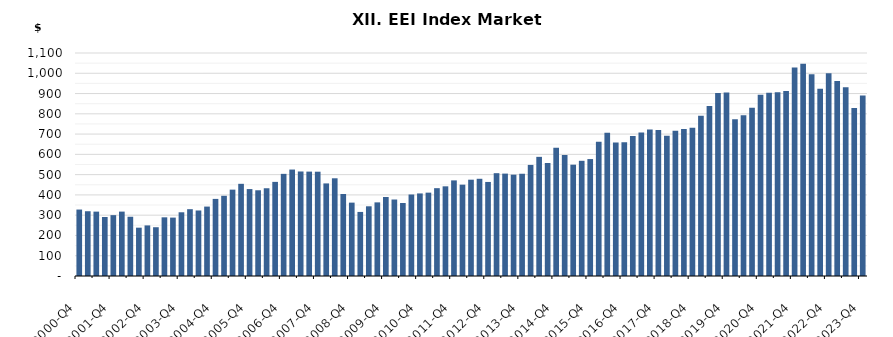
| Category | Series 0 |
|---|---|
|  2000-Q4  | 327.808 |
|  2001-Q1  | 319.484 |
|  2001-Q2  | 317.546 |
|  2001-Q3  | 291.035 |
|  2001-Q4  | 300.2 |
|  2002-Q1  | 317.668 |
|  2002-Q2  | 292.238 |
|  2002-Q3  | 238.331 |
|  2002-Q4  | 249.553 |
|  2003-Q1  | 240.598 |
|  2003-Q2  | 289.454 |
|  2003-Q3  | 288.073 |
|  2003-Q4  | 314.324 |
|  2004-Q1  | 329.601 |
|  2004-Q2  | 323.193 |
|  2004-Q3  | 342.46 |
|  2004-Q4  | 380.305 |
|  2005-Q1  | 395.663 |
|  2005-Q2  | 425.989 |
|  2005-Q3  | 454.727 |
|  2005-Q4  | 428.825 |
|  2006-Q1  | 422.899 |
|  2006-Q2  | 432.848 |
|  2006-Q3  | 464.281 |
|  2006-Q4  | 503.858 |
|  2007-Q1  | 525.088 |
|  2007-Q2  | 515.565 |
|  2007-Q3  | 514.946 |
|  2007-Q4  | 514.486 |
|  2008-Q1  | 456.711 |
|  2008-Q2  | 482.024 |
|  2008-Q3  | 404.472 |
|  2008-Q4  | 361.921 |
|  2009-Q1  | 316.07 |
|  2009-Q2  | 343.844 |
|  2009-Q3  | 363.185 |
|  2009-Q4  | 389.672 |
|  2010-Q1  | 377.281 |
|  2010-Q2  | 360.044 |
|  2010-Q3  | 402.014 |
|  2010-Q4  | 407.275 |
|  2011-Q1  | 411.164 |
|  2011-Q2  | 433.236 |
|  2011-Q3  | 442.352 |
|  2011-Q4  | 471.635 |
|  2012-Q1  | 450.597 |
|  2012-Q2  | 475.083 |
|  2012-Q3  | 479.54 |
|  2012-Q4  | 463.916 |
|  2013-Q1  | 507.163 |
|  2013-Q2  | 505.091 |
|  2013-Q3  | 499.776 |
|  2013-Q4  | 504.365 |
|  2014-Q1  | 548.006 |
|  2014-Q2  | 587.735 |
|  2014-Q3  | 557.472 |
|  2014-Q4  | 632.185 |
|  2015-Q1  | 596.851 |
|  2015-Q2  | 549.164 |
|  2015-Q3  | 568.25 |
|  2015-Q4  | 576.819 |
|  2016-Q1  | 662.574 |
|  2016-Q2  | 706.366 |
|  2016-Q3  | 658.728 |
|  2016-Q4  | 659.845 |
|  2017-Q1  | 690.205 |
|  2017-Q2  | 708.329 |
|  2017-Q3  | 722.423 |
|  2017-Q4  | 720.427 |
|  2018-Q1  | 692.282 |
|  2018-Q2  | 716.35 |
|  2018-Q3  | 724.766 |
|  2018-Q4  | 731.313 |
|  2019-Q1  | 790.291 |
|  2019-Q2  | 838.256 |
|  2019-Q3  | 902.428 |
|  2019-Q4  | 905.009 |
|  2020-Q1  | 773.536 |
|  2020-Q2  | 792.349 |
|  2020-Q3  | 829.764 |
|  2020-Q4  | 894.49 |
|  2021-Q1  | 904.454 |
|  2021-Q2  | 906.539 |
|  2021-Q3  | 912.717 |
|  2021-Q4  | 1028.48 |
|  2022-Q1  | 1047.459 |
|  2022-Q2  | 995.058 |
|  2022-Q3  | 924.087 |
|  2022-Q4  | 999.904 |
|  2023-Q1  | 961.977 |
|  2023-Q2  | 930.914 |
|  2023-Q3  | 828.704 |
|  2023-Q4  | 890.003 |